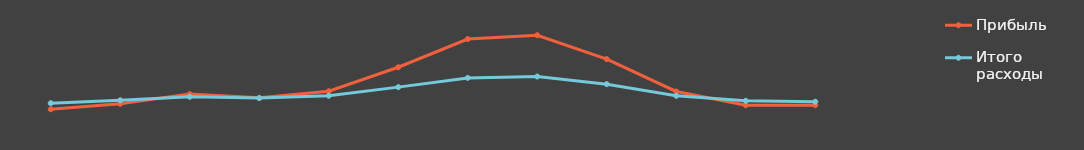
| Category | Прибыль | Итого расходы |
|---|---|---|
| 0 | 89596.5 | 122254.74 |
| 1 | 118887.3 | 137799.428 |
| 2 | 170766.96 | 156476.106 |
| 3 | 151107.6 | 149398.736 |
| 4 | 186276.09 | 162059.392 |
| 5 | 314653.5 | 208275.26 |
| 6 | 465790.71 | 257684.656 |
| 7 | 486391.5 | 265100.94 |
| 8 | 358623.72 | 224104.539 |
| 9 | 184944.375 | 161579.975 |
| 10 | 111134.94 | 135008.578 |
| 11 | 111508.74 | 130143.146 |